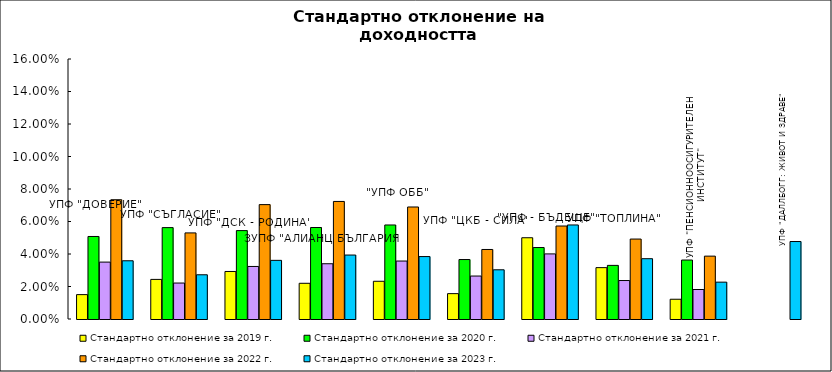
| Category | Стандартно отклонение за 2019 г. | Стандартно отклонение за 2020 г. | Стандартно отклонение за 2021 г. | Стандартно отклонение за 2022 г. | Стандартно отклонение за 2023 г. |
|---|---|---|---|---|---|
| УПФ "ДОВЕРИЕ"  | 0.015 | 0.051 | 0.035 | 0.073 | 0.036 |
| УПФ "СЪГЛАСИЕ" | 0.024 | 0.056 | 0.022 | 0.053 | 0.027 |
| УПФ "ДСК - РОДИНА" | 0.029 | 0.054 | 0.032 | 0.07 | 0.036 |
| ЗУПФ "АЛИАНЦ БЪЛГАРИЯ" | 0.022 | 0.056 | 0.034 | 0.072 | 0.039 |
| "УПФ ОББ" | 0.023 | 0.058 | 0.036 | 0.069 | 0.038 |
| УПФ "ЦКБ - СИЛА" | 0.016 | 0.037 | 0.026 | 0.043 | 0.03 |
| "УПФ - БЪДЕЩЕ" | 0.05 | 0.044 | 0.04 | 0.057 | 0.058 |
| УПФ "ТОПЛИНА" | 0.032 | 0.033 | 0.024 | 0.049 | 0.037 |
| УПФ "ПЕНСИОННООСИГУРИТЕЛЕН ИНСТИТУТ" | 0.012 | 0.036 | 0.018 | 0.039 | 0.023 |
| УПФ "ДАЛЛБОГГ: ЖИВОТ И ЗДРАВЕ" | 0 | 0 | 0 | 0 | 0.048 |